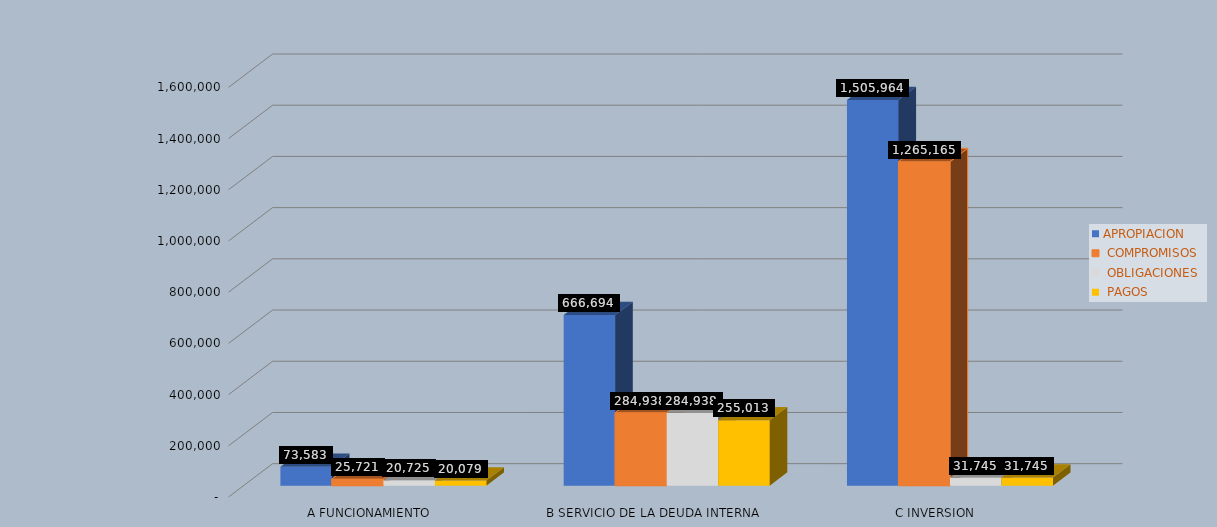
| Category | APROPIACION |  COMPROMISOS |  OBLIGACIONES |  PAGOS |
|---|---|---|---|---|
| A FUNCIONAMIENTO | 73583.024 | 25720.806 | 20725.039 | 20078.658 |
| B SERVICIO DE LA DEUDA INTERNA | 666693.529 | 284938.138 | 284938.138 | 255012.607 |
| C INVERSION | 1505964.092 | 1265164.596 | 31745.455 | 31745.455 |